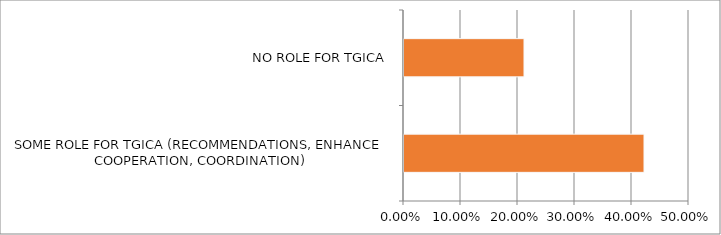
| Category | Series 0 |
|---|---|
| SOME ROLE FOR TGICA (RECOMMENDATIONS, ENHANCE COOPERATION, COORDINATION) | 0.421 |
| NO ROLE FOR TGICA | 0.211 |